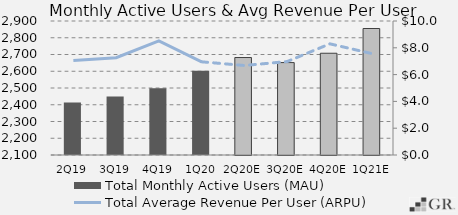
| Category | Total Monthly Active Users (MAU)  |
|---|---|
|  2Q19  | 2414 |
|  3Q19  | 2449 |
|  4Q19  | 2497.8 |
|  1Q20  | 2603 |
|  2Q20E  | 2681.92 |
|  3Q20E  | 2651.694 |
|  4Q20E  | 2707.476 |
|  1Q21E  | 2855.173 |